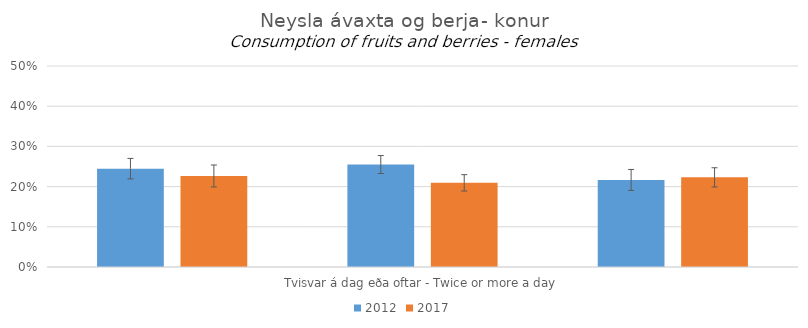
| Category | 2012 | 2017 |
|---|---|---|
| 0 | 0.245 | 0.226 |
| 1 | 0.255 | 0.209 |
| 2 | 0.217 | 0.223 |